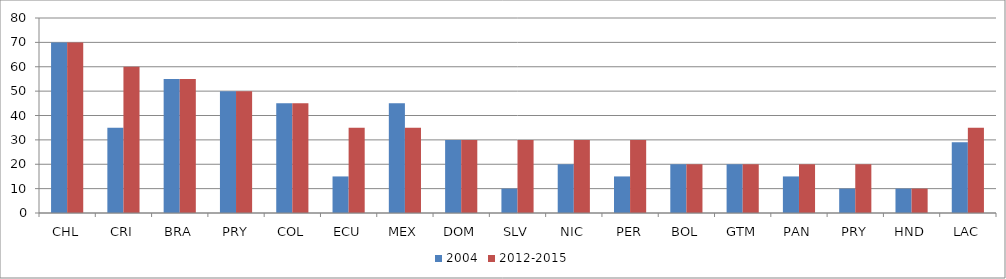
| Category | 2004 | 2012-2015 |
|---|---|---|
| CHL | 70 | 70 |
| CRI | 35 | 60 |
| BRA | 55 | 55 |
| PRY | 50 | 50 |
| COL | 45 | 45 |
| ECU | 15 | 35 |
| MEX | 45 | 35 |
| DOM | 30 | 30 |
| SLV | 10 | 30 |
| NIC | 20 | 30 |
| PER | 15 | 30 |
| BOL | 20 | 20 |
| GTM | 20 | 20 |
| PAN | 15 | 20 |
| PRY | 10 | 20 |
| HND | 10 | 10 |
| LAC | 29.062 | 35 |